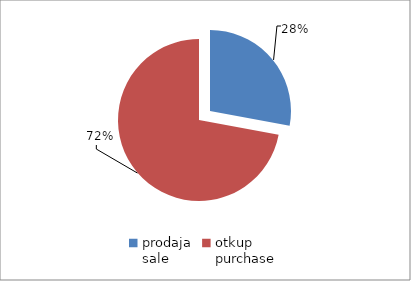
| Category | Series 0 |
|---|---|
| prodaja
sale | 7229956.8 |
| otkup
purchase | 18652540.82 |